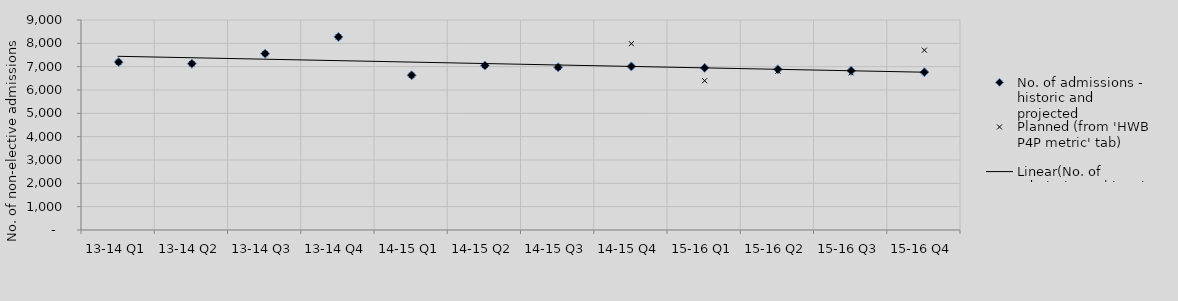
| Category | No. of admissions - historic and projected | Planned (from 'HWB P4P metric' tab) |
|---|---|---|
| 13-14 Q1 | 7194.481 | 7194.481 |
| 13-14 Q2 | 7126.189 | 7126.189 |
| 13-14 Q3 | 7557.328 | 7557.328 |
| 13-14 Q4 | 8276.461 | 8276.461 |
| 14-15 Q1 | 6629.346 | 6629.346 |
| 14-15 Q2 | 7050.308 | 7050.308 |
| 14-15 Q3 | 6975.932 | 6975.932 |
| 14-15 Q4 | 7010.665 | 7986 |
| 15-16 Q1 | 6948.686 | 6397 |
| 15-16 Q2 | 6886.708 | 6803 |
| 15-16 Q3 | 6824.73 | 6732 |
| 15-16 Q4 | 6762.752 | 7706 |